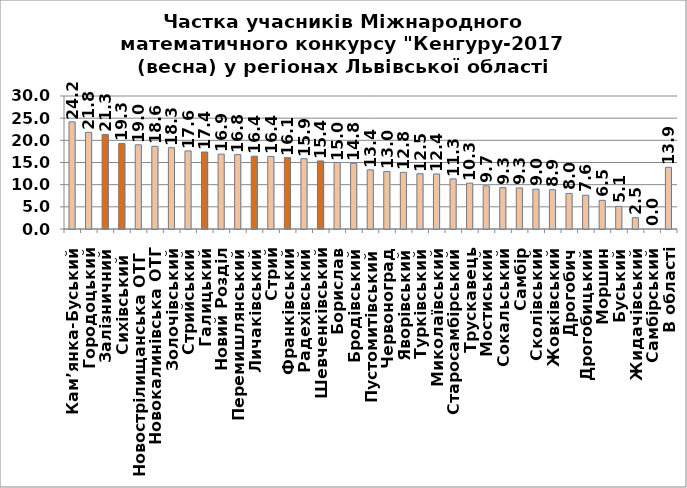
| Category | Р |
|---|---|
| Кам’янка-Буський | 24.172 |
| Городоцький | 21.809 |
| Залізничний | 21.326 |
| Сихівський  | 19.292 |
| Новострілищанська ОТГ  | 18.987 |
| Новокалинівська ОТГ | 18.647 |
| Золочівський | 18.339 |
| Стрийський | 17.615 |
| Галицький | 17.362 |
| Новий Розділ | 16.886 |
| Перемишлянський | 16.781 |
| Личаківський | 16.421 |
| Стрий | 16.376 |
| Франківський | 16.096 |
| Радехівський | 15.852 |
| Шевченківський | 15.353 |
| Борислав | 15 |
| Бродівський | 14.811 |
| Пустомитівський | 13.351 |
| Червоноград | 12.976 |
| Яворівський | 12.775 |
| Турківський | 12.472 |
| Миколаївський | 12.415 |
| Старосамбірський | 11.303 |
| Трускавець | 10.339 |
| Мостиський | 9.734 |
| Сокальський | 9.327 |
| Самбір | 9.264 |
| Сколівський | 8.983 |
| Жовківський | 8.872 |
| Дрогобич | 8.023 |
| Дрогобицький | 7.623 |
| Моршин | 6.471 |
| Буський | 5.099 |
| Жидачівський | 2.544 |
| Самбірський | 0 |
| В області | 13.922 |